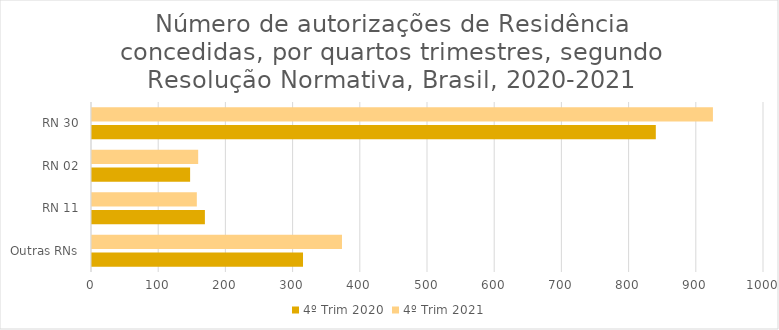
| Category | 4º Trim 2020 | 4º Trim 2021 |
|---|---|---|
| Outras RNs | 314 | 372 |
| RN 11 | 168 | 156 |
| RN 02 | 146 | 158 |
| RN 30 | 839 | 924 |